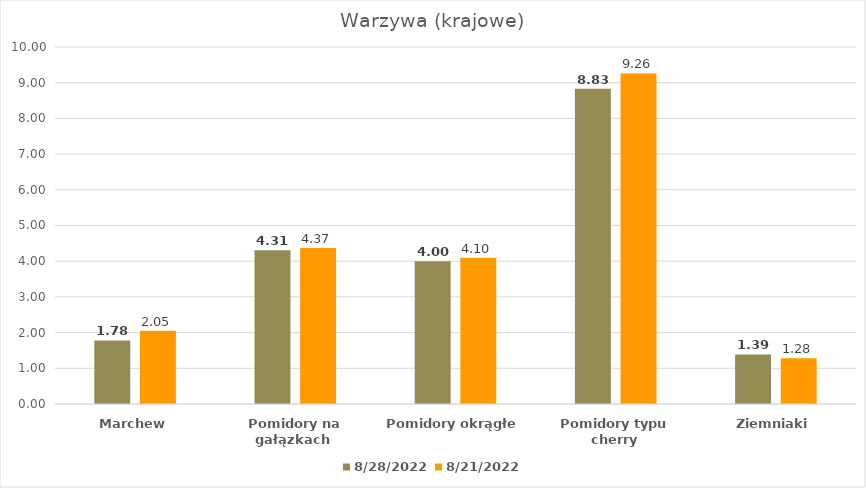
| Category | 28.08.2022 | 21.08.2022 |
|---|---|---|
| Marchew | 1.78 | 2.05 |
| Pomidory na gałązkach  | 4.31 | 4.37 |
| Pomidory okrągłe | 4 | 4.1 |
| Pomidory typu cherry | 8.83 | 9.26 |
| Ziemniaki | 1.39 | 1.28 |